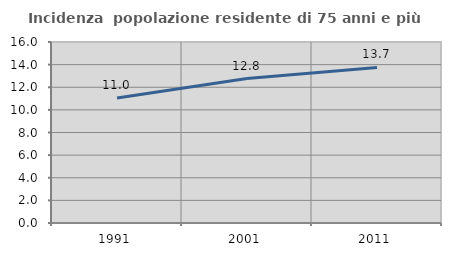
| Category | Incidenza  popolazione residente di 75 anni e più |
|---|---|
| 1991.0 | 11.048 |
| 2001.0 | 12.767 |
| 2011.0 | 13.748 |